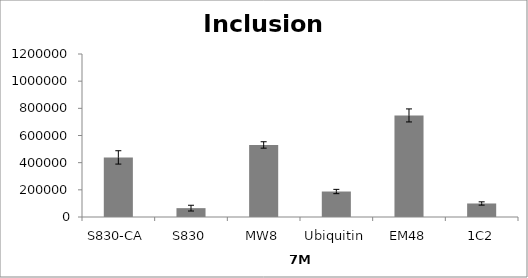
| Category | Series 0 |
|---|---|
| S830-CA | 438680.849 |
| S830 | 65182.342 |
| MW8 | 530353.15 |
| Ubiquitin | 187625.228 |
| EM48 | 747741.831 |
| 1C2 | 99544.782 |